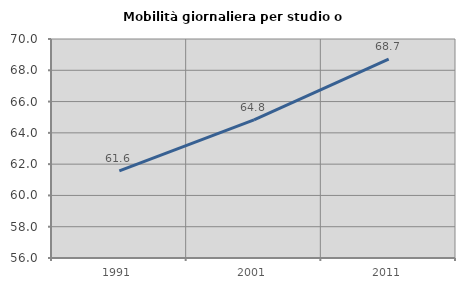
| Category | Mobilità giornaliera per studio o lavoro |
|---|---|
| 1991.0 | 61.567 |
| 2001.0 | 64.825 |
| 2011.0 | 68.714 |